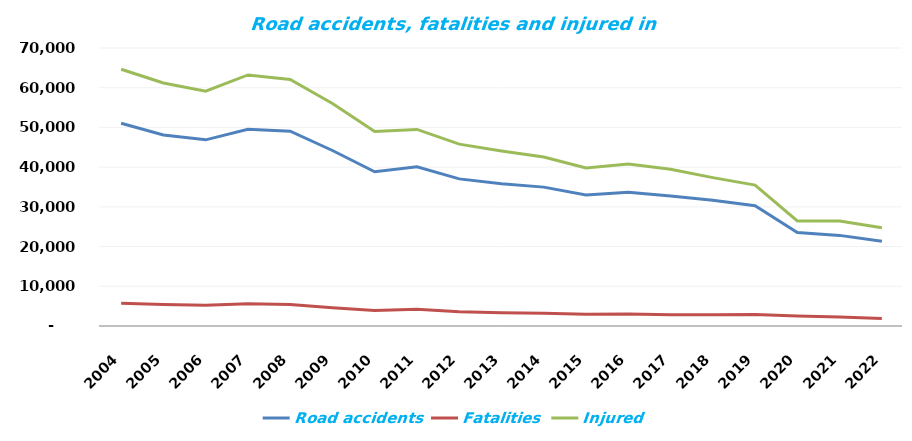
| Category | Road accidents | Fatalities | Injured |
|---|---|---|---|
| 2004.0 | 51069 | 5712 | 64661 |
| 2005.0 | 48100 | 5444 | 61191 |
| 2006.0 | 46876 | 5243 | 59123 |
| 2007.0 | 49536 | 5583 | 63224 |
| 2008.0 | 49054 | 5437 | 62097 |
| 2009.0 | 44196 | 4572 | 56046 |
| 2010.0 | 38832 | 3907 | 48952 |
| 2011.0 | 40065 | 4189 | 49501 |
| 2012.0 | 37046 | 3571 | 45792 |
| 2013.0 | 35847 | 3357 | 44059 |
| 2014.0 | 34970 | 3202 | 42545 |
| 2015.0 | 32967 | 2938 | 39778 |
| 2016.0 | 33664 | 3026 | 40766 |
| 2017.0 | 32760 | 2831 | 39466 |
| 2018.0 | 31674 | 2862 | 37359 |
| 2019.0 | 30288 | 2909 | 35477 |
| 2020.0 | 23540 | 2491 | 26463 |
| 2021.0 | 22816 | 2245 | 26415 |
| 2022.0 | 21322 | 1896 | 24743 |